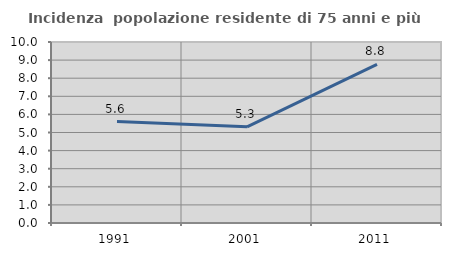
| Category | Incidenza  popolazione residente di 75 anni e più |
|---|---|
| 1991.0 | 5.603 |
| 2001.0 | 5.311 |
| 2011.0 | 8.759 |